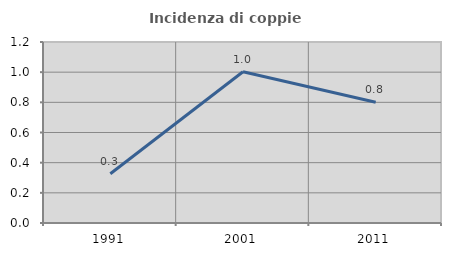
| Category | Incidenza di coppie miste |
|---|---|
| 1991.0 | 0.326 |
| 2001.0 | 1.003 |
| 2011.0 | 0.801 |